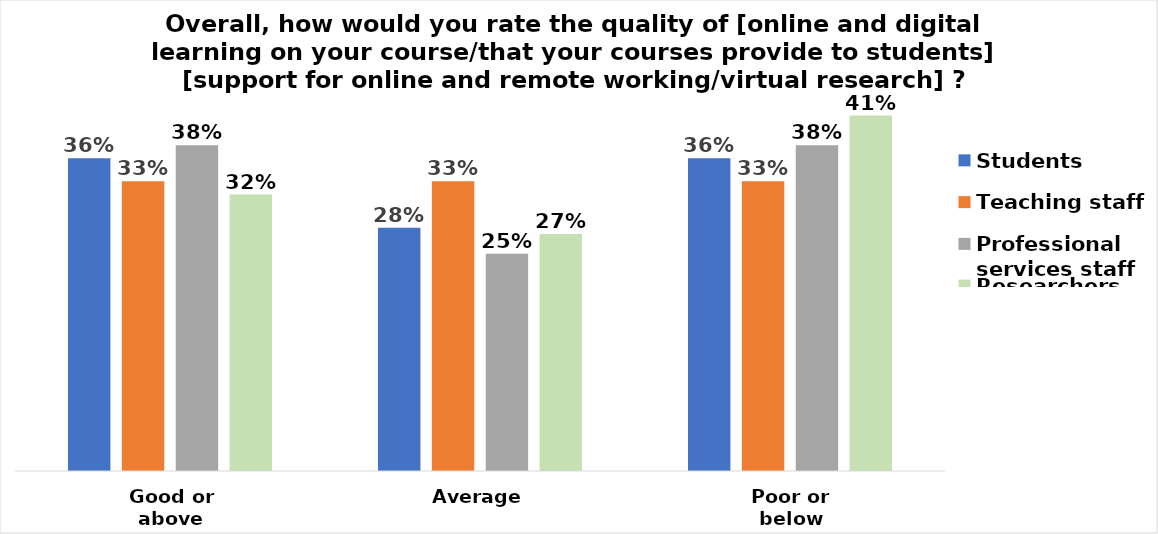
| Category | Students | Teaching staff | Professional services staff | Researchers |
|---|---|---|---|---|
| Good or above | 0.36 | 0.333 | 0.375 | 0.318 |
| Average | 0.28 | 0.333 | 0.25 | 0.273 |
| Poor or below | 0.36 | 0.333 | 0.375 | 0.409 |